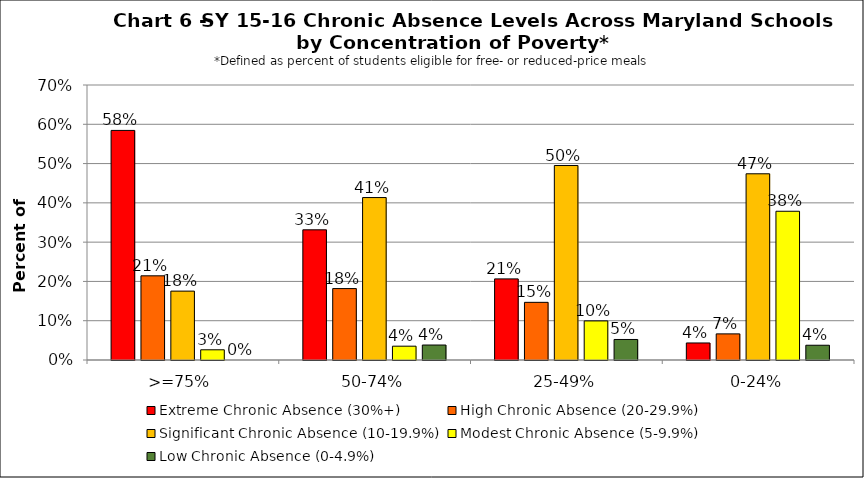
| Category | Extreme Chronic Absence (30%+) | High Chronic Absence (20-29.9%) | Significant Chronic Absence (10-19.9%) | Modest Chronic Absence (5-9.9%) | Low Chronic Absence (0-4.9%) |
|---|---|---|---|---|---|
| 0 | 0.584 | 0.214 | 0.175 | 0.026 | 0 |
| 1 | 0.331 | 0.182 | 0.413 | 0.035 | 0.038 |
| 2 | 0.206 | 0.147 | 0.495 | 0.1 | 0.052 |
| 3 | 0.043 | 0.066 | 0.474 | 0.379 | 0.038 |